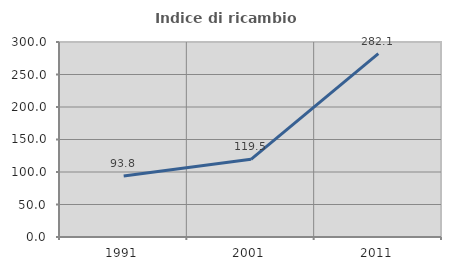
| Category | Indice di ricambio occupazionale  |
|---|---|
| 1991.0 | 93.842 |
| 2001.0 | 119.492 |
| 2011.0 | 282.065 |